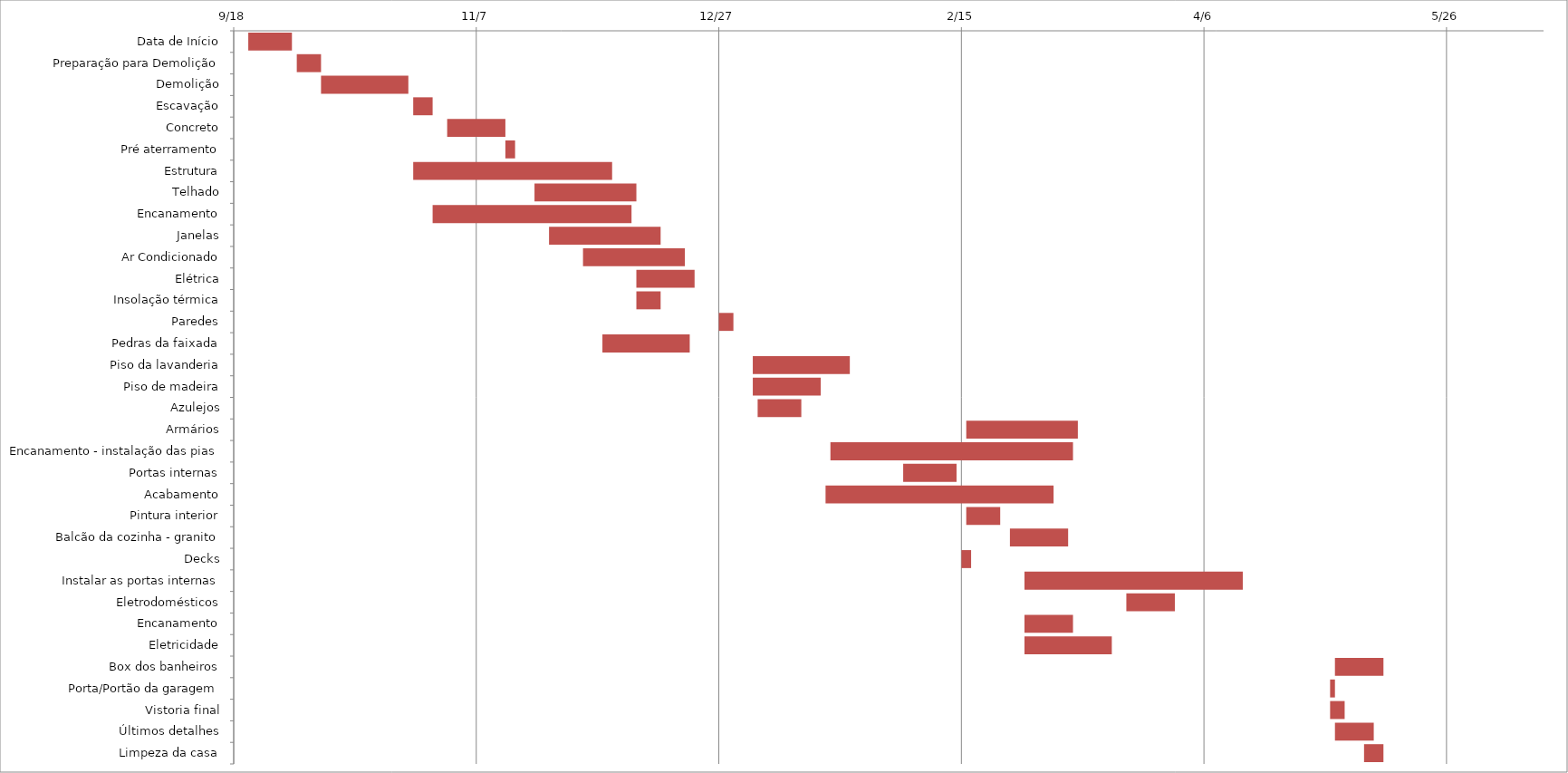
| Category | Start Date | Duration |
|---|---|---|
| Data de Início | 9/21/14 | 9 |
| Preparação para Demolição | 10/1/14 | 5 |
| Demolição | 10/6/14 | 18 |
| Escavação | 10/25/14 | 4 |
| Concreto | 11/1/14 | 12 |
| Pré aterramento | 11/13/14 | 2 |
| Estrutura | 10/25/14 | 41 |
| Telhado | 11/19/14 | 21 |
| Encanamento | 10/29/14 | 41 |
| Janelas | 11/22/14 | 23 |
| Ar Condicionado | 11/29/14 | 21 |
| Elétrica | 12/10/14 | 12 |
| Insolação térmica | 12/10/14 | 5 |
| Paredes | 12/27/14 | 3 |
| Pedras da faixada | 12/3/14 | 18 |
| Piso da lavanderia | 1/3/15 | 20 |
| Piso de madeira | 1/3/15 | 14 |
| Azulejos | 1/4/15 | 9 |
| Armários | 2/16/15 | 23 |
| Encanamento - instalação das pias | 1/19/15 | 50 |
| Portas internas | 2/3/15 | 11 |
| Acabamento | 1/18/15 | 47 |
| Pintura interior | 2/16/15 | 7 |
| Balcão da cozinha - granito | 2/25/15 | 12 |
| Decks | 2/15/15 | 2 |
| Instalar as portas internas | 2/28/15 | 45 |
| Eletrodomésticos | 3/21/15 | 10 |
| Encanamento | 2/28/15 | 10 |
| Eletricidade | 2/28/15 | 18 |
| Box dos banheiros | 5/3/15 | 10 |
| Porta/Portão da garagem | 5/2/15 | 1 |
| Vistoria final | 5/2/15 | 3 |
| Últimos detalhes | 5/3/15 | 8 |
| Limpeza da casa | 5/9/15 | 4 |